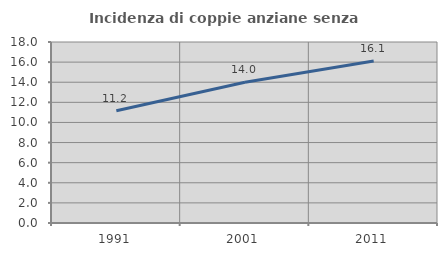
| Category | Incidenza di coppie anziane senza figli  |
|---|---|
| 1991.0 | 11.155 |
| 2001.0 | 14 |
| 2011.0 | 16.111 |